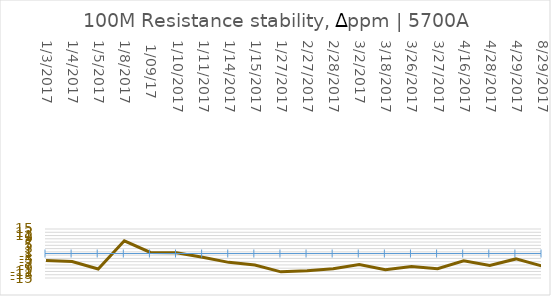
| Category | Series 0 |
|---|---|
| 1/3/2017 | -4.33 |
| 1/4/2017 | -4.9 |
| 1/5/2017 | -9.5 |
| 1/8/2017 | 7.78 |
|  1/09/17 | 0.64 |
| 1/10/2017 | 0.41 |
| 1/11/2017 | -2.24 |
| 1/14/2017 | -5.42 |
| 1/15/2017 | -7.02 |
| 1/27/2017 | -11.22 |
| 2/27/2017 | -10.54 |
| 2/28/2017 | -9.31 |
| 3/2/2017 | -6.73 |
| 3/18/2017 | -9.96 |
| 3/26/2017 | -7.92 |
| 3/27/2017 | -9.36 |
| 4/16/2017 | -4.5 |
| 4/28/2017 | -7.36 |
| 4/29/2017 | -3.32 |
| 8/29/2017 | -7.69 |